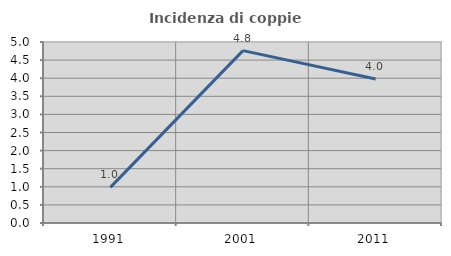
| Category | Incidenza di coppie miste |
|---|---|
| 1991.0 | 0.985 |
| 2001.0 | 4.762 |
| 2011.0 | 3.98 |